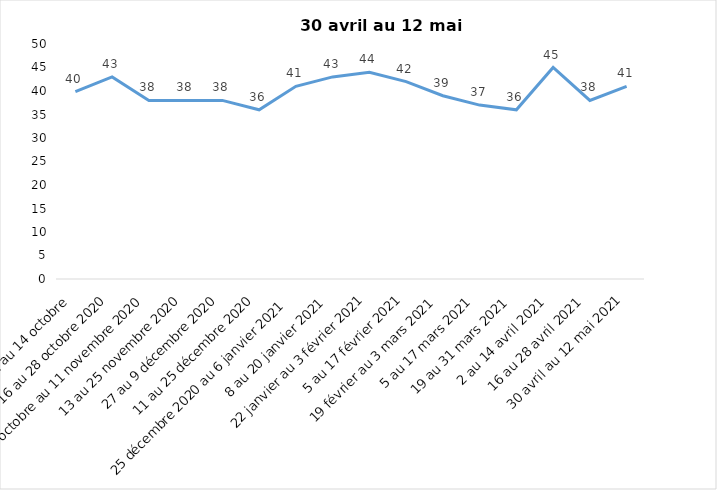
| Category | Toujours aux trois mesures |
|---|---|
| 2 au 14 octobre  | 39.85 |
| 16 au 28 octobre 2020 | 43 |
| 30 octobre au 11 novembre 2020 | 38 |
| 13 au 25 novembre 2020 | 38 |
| 27 au 9 décembre 2020 | 38 |
| 11 au 25 décembre 2020 | 36 |
| 25 décembre 2020 au 6 janvier 2021 | 41 |
| 8 au 20 janvier 2021 | 43 |
| 22 janvier au 3 février 2021 | 44 |
| 5 au 17 février 2021 | 42 |
| 19 février au 3 mars 2021 | 39 |
| 5 au 17 mars 2021 | 37 |
| 19 au 31 mars 2021 | 36 |
| 2 au 14 avril 2021 | 45 |
| 16 au 28 avril 2021 | 38 |
| 30 avril au 12 mai 2021 | 41 |